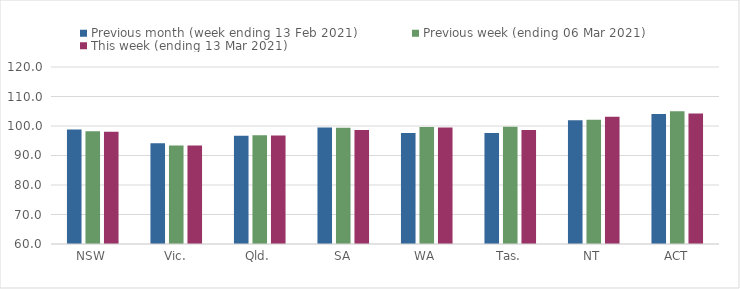
| Category | Previous month (week ending 13 Feb 2021) | Previous week (ending 06 Mar 2021) | This week (ending 13 Mar 2021) |
|---|---|---|---|
| NSW | 98.84 | 98.23 | 98.01 |
| Vic. | 94.18 | 93.35 | 93.43 |
| Qld. | 96.68 | 96.9 | 96.8 |
| SA | 99.48 | 99.42 | 98.68 |
| WA | 97.61 | 99.68 | 99.5 |
| Tas. | 97.63 | 99.76 | 98.66 |
| NT | 101.95 | 102.12 | 103.15 |
| ACT | 104.03 | 105.02 | 104.22 |